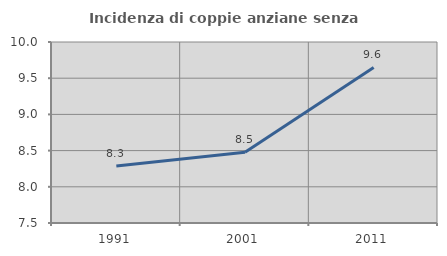
| Category | Incidenza di coppie anziane senza figli  |
|---|---|
| 1991.0 | 8.286 |
| 2001.0 | 8.477 |
| 2011.0 | 9.648 |